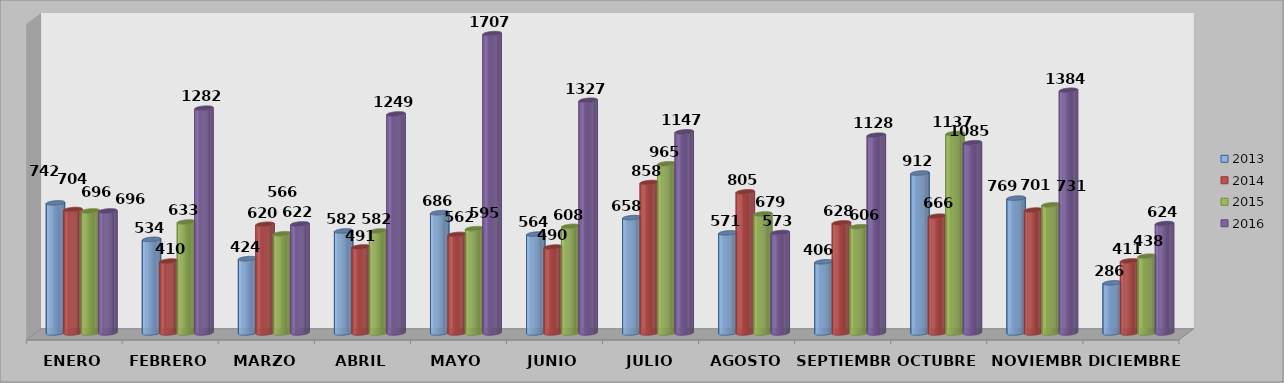
| Category | 2013 | 2014 | 2015 | 2016 |
|---|---|---|---|---|
| ENERO | 742 | 704 | 696 | 696 |
| FEBRERO | 534 | 410 | 633 | 1282 |
| MARZO | 424 | 620 | 566 | 622 |
| ABRIL | 582 | 491 | 582 | 1249 |
| MAYO | 686 | 562 | 595 | 1707 |
| JUNIO | 564 | 490 | 608 | 1327 |
| JULIO | 658 | 858 | 965 | 1147 |
| AGOSTO | 571 | 805 | 679 | 573 |
| SEPTIEMBRE | 406 | 628 | 606 | 1128 |
| OCTUBRE | 912 | 666 | 1137 | 1085 |
| NOVIEMBRE | 769 | 701 | 731 | 1384 |
| DICIEMBRE | 286 | 411 | 438 | 624 |